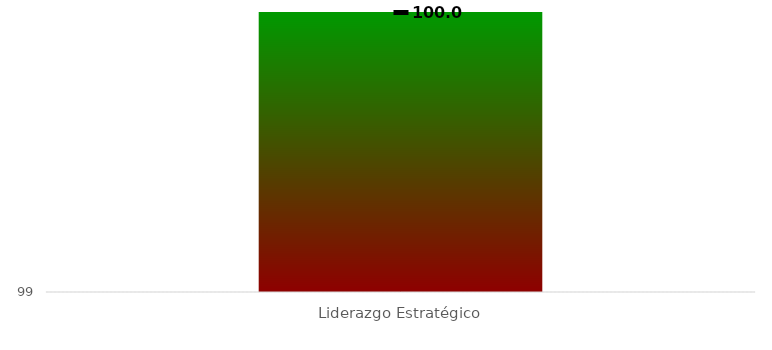
| Category | Series 0 |
|---|---|
| Liderazgo Estratégico | 100 |